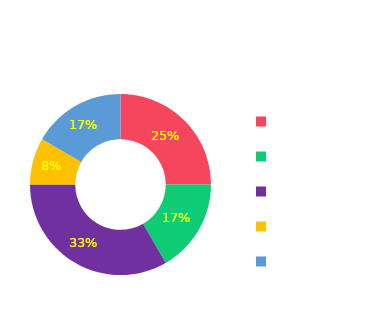
| Category | Series 0 |
|---|---|
| AGRIBANK | 0.25 |
| BIDV | 0.167 |
| MB | 0.333 |
| VIETCOMBANK | 0.083 |
| VIETTINBANK | 0.167 |